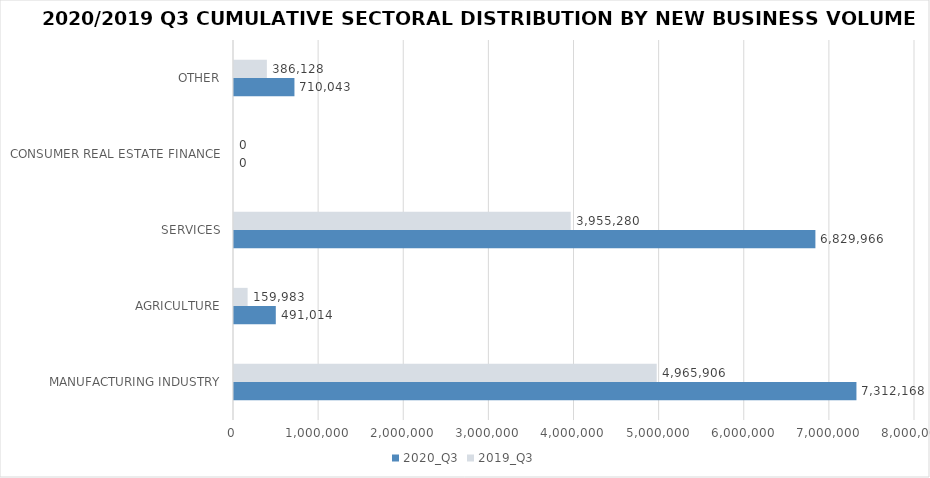
| Category | 2020_Q3 | 2019_Q3 |
|---|---|---|
| MANUFACTURING INDUSTRY | 7312168.18 | 4965905.816 |
| AGRICULTURE | 491013.571 | 159982.93 |
| SERVICES | 6829966.082 | 3955280.16 |
| CONSUMER REAL ESTATE FINANCE | 0 | 0 |
| OTHER | 710043.38 | 386128.15 |